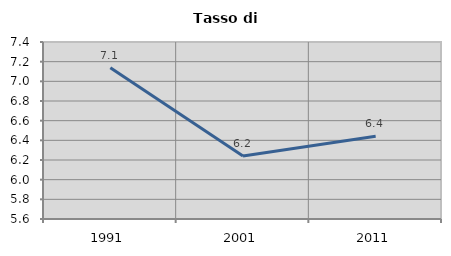
| Category | Tasso di disoccupazione   |
|---|---|
| 1991.0 | 7.137 |
| 2001.0 | 6.241 |
| 2011.0 | 6.442 |